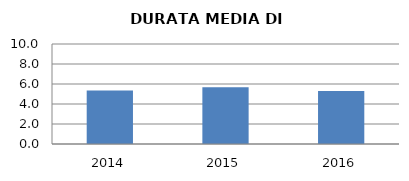
| Category | 2014 2015 2016 |
|---|---|
| 2014.0 | 5.357 |
| 2015.0 | 5.667 |
| 2016.0 | 5.3 |